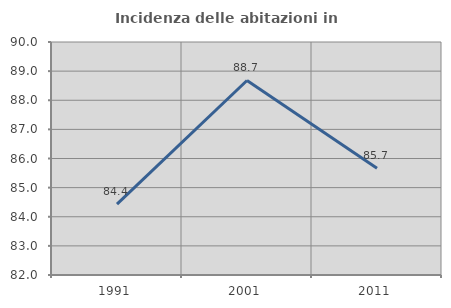
| Category | Incidenza delle abitazioni in proprietà  |
|---|---|
| 1991.0 | 84.431 |
| 2001.0 | 88.679 |
| 2011.0 | 85.665 |